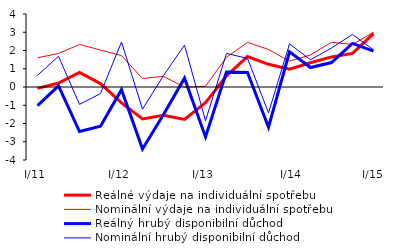
| Category | Reálné výdaje na individuální spotřebu  | Nominální výdaje na individuální spotřebu | Reálný hrubý disponibilní důchod  | Nominální hrubý disponibilní důchod   |
|---|---|---|---|---|
| I/11 | -0.073 | 1.604 | -1.022 | 0.639 |
| II | 0.216 | 1.835 | 0.065 | 1.682 |
| III | 0.793 | 2.331 | -2.44 | -0.952 |
| IV | 0.189 | 2.026 | -2.154 | -0.36 |
| I/12 | -0.873 | 1.721 | -0.145 | 2.468 |
| II | -1.753 | 0.466 | -3.396 | -1.214 |
| III | -1.553 | 0.584 | -1.509 | 0.629 |
| IV | -1.781 | -0.012 | 0.483 | 2.294 |
| I/13 | -0.862 | 0.04 | -2.735 | -1.851 |
| II | 0.613 | 1.63 | 0.82 | 1.839 |
| III | 1.666 | 2.447 | 0.792 | 1.567 |
|  IV | 1.242 | 2.055 | -2.203 | -1.417 |
|   I/14 | 0.979 | 1.411 | 1.926 | 2.362 |
| II | 1.33 | 1.759 | 1.067 | 1.494 |
| III | 1.648 | 2.449 | 1.34 | 2.139 |
| IV | 1.843 | 2.334 | 2.386 | 2.88 |
|  I/15 | 2.928 | 3.001 | 1.964 | 2.036 |